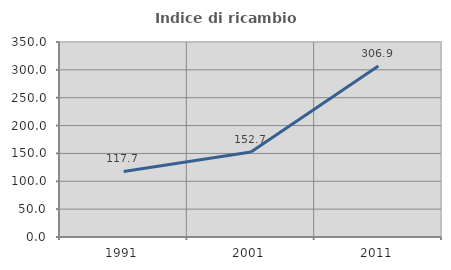
| Category | Indice di ricambio occupazionale  |
|---|---|
| 1991.0 | 117.662 |
| 2001.0 | 152.727 |
| 2011.0 | 306.931 |